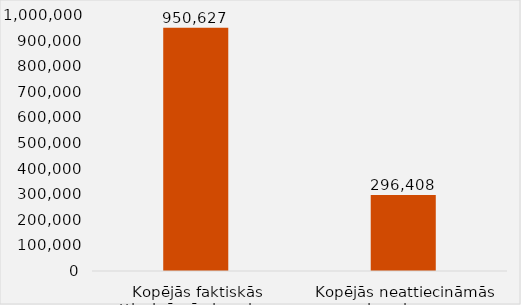
| Category | Series 0 |
|---|---|
| Kopējās faktiskās attiecināmās izmaksas  | 950626.56 |
| Kopējās neattiecināmās izmaksas  | 296408.104 |